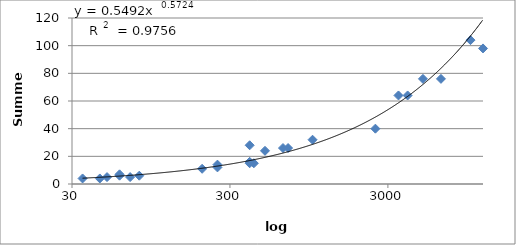
| Category | Gewicht |
|---|---|
| 35.0 | 4 |
| 45.0 | 4 |
| 50.0 | 5 |
| 60.0 | 6 |
| 60.0 | 7 |
| 70.0 | 5 |
| 80.0 | 6 |
| 200.0 | 11 |
| 250.0 | 14 |
| 250.0 | 12 |
| 400.0 | 16 |
| 400.0 | 15 |
| 400.0 | 28 |
| 425.0 | 15 |
| 500.0 | 24 |
| 650.0 | 26 |
| 700.0 | 26 |
| 1000.0 | 32 |
| 2500.0 | 40 |
| 3500.0 | 64 |
| 4000.0 | 64 |
| 5000.0 | 76 |
| 6500.0 | 76 |
| 10000.0 | 104 |
| 12000.0 | 98 |